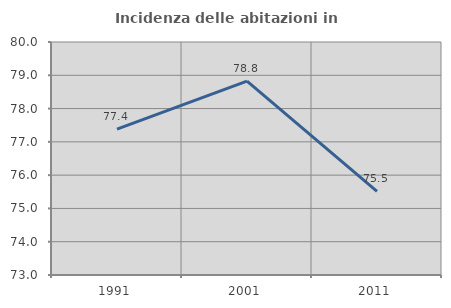
| Category | Incidenza delle abitazioni in proprietà  |
|---|---|
| 1991.0 | 77.381 |
| 2001.0 | 78.824 |
| 2011.0 | 75.51 |